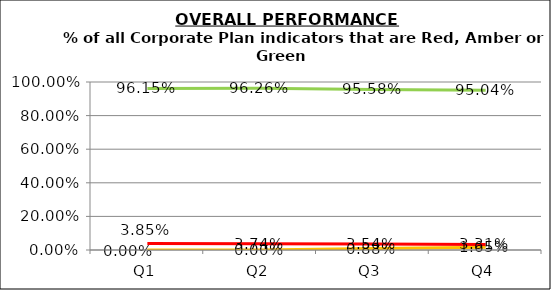
| Category | Green | Amber | Red |
|---|---|---|---|
| Q1 | 0.962 | 0 | 0.038 |
| Q2 | 0.963 | 0 | 0.037 |
| Q3 | 0.956 | 0.009 | 0.035 |
| Q4 | 0.95 | 0.017 | 0.033 |